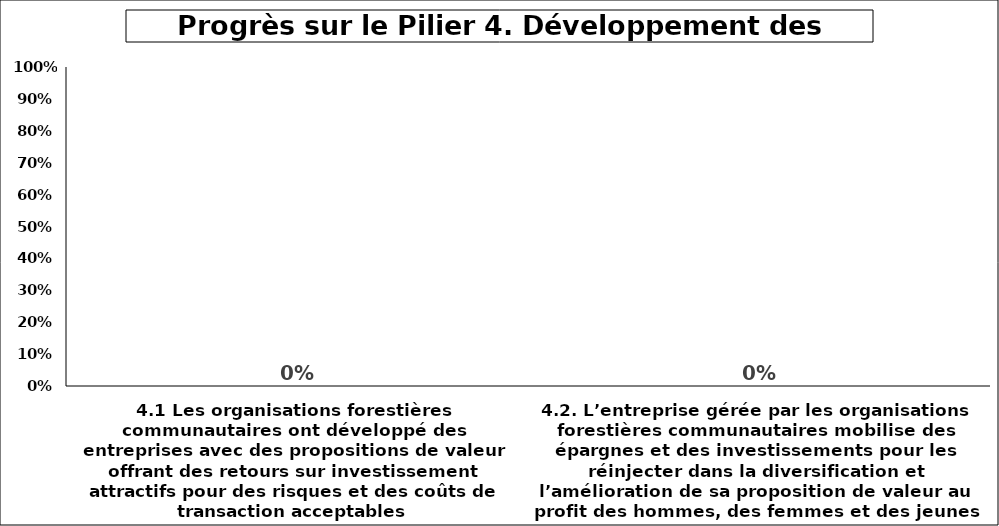
| Category | Series 6 |
|---|---|
| 4.1 Les organisations forestières communautaires ont développé des entreprises avec des propositions de valeur offrant des retours sur investissement attractifs pour des risques et des coûts de transaction acceptables  | 0 |
| 4.2. L’entreprise gérée par les organisations forestières communautaires mobilise des épargnes et des investissements pour les réinjecter dans la diversification et l’amélioration de sa proposition de valeur au profit des hommes, des femmes et des jeunes | 0 |